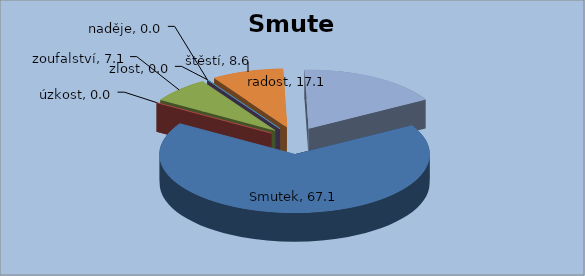
| Category | Smutek |
|---|---|
| Smutek | 67.143 |
| úzkost | 0 |
| zoufalství | 7.143 |
| zlost | 0 |
| naděje | 0 |
| štěstí | 8.571 |
| radost | 17.143 |